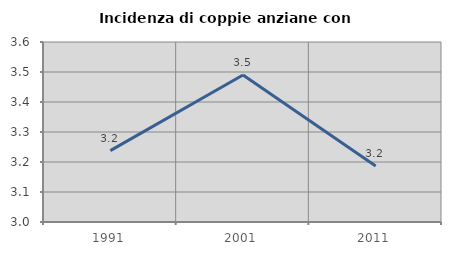
| Category | Incidenza di coppie anziane con figli |
|---|---|
| 1991.0 | 3.238 |
| 2001.0 | 3.49 |
| 2011.0 | 3.187 |